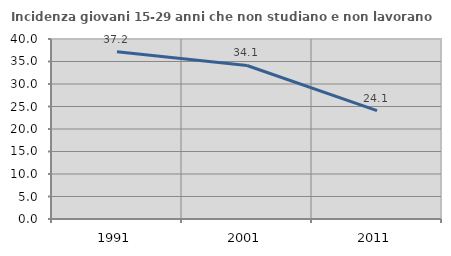
| Category | Incidenza giovani 15-29 anni che non studiano e non lavorano  |
|---|---|
| 1991.0 | 37.179 |
| 2001.0 | 34.115 |
| 2011.0 | 24.078 |